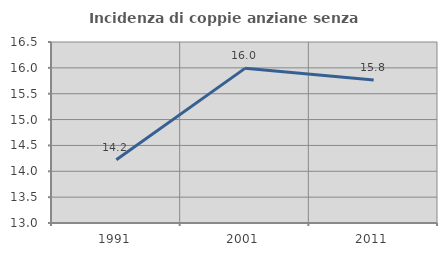
| Category | Incidenza di coppie anziane senza figli  |
|---|---|
| 1991.0 | 14.221 |
| 2001.0 | 15.99 |
| 2011.0 | 15.764 |